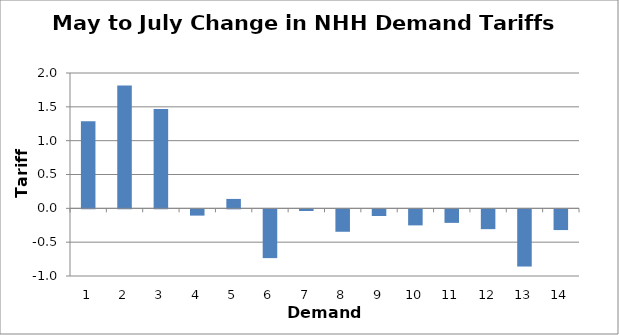
| Category | Change (p/kWh) |
|---|---|
| 0 | 1.288 |
| 1 | 1.815 |
| 2 | 1.47 |
| 3 | -0.093 |
| 4 | 0.139 |
| 5 | -0.721 |
| 6 | -0.025 |
| 7 | -0.332 |
| 8 | -0.099 |
| 9 | -0.237 |
| 10 | -0.2 |
| 11 | -0.293 |
| 12 | -0.845 |
| 13 | -0.306 |